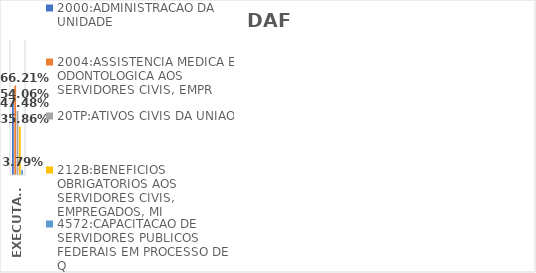
| Category | 2000:ADMINISTRACAO DA UNIDADE | 2004:ASSISTENCIA MEDICA E ODONTOLOGICA AOS SERVIDORES CIVIS, EMPR | 20TP:ATIVOS CIVIS DA UNIAO | 212B:BENEFICIOS OBRIGATORIOS AOS SERVIDORES CIVIS, EMPREGADOS, MI | 4572:CAPACITACAO DE SERVIDORES PUBLICOS FEDERAIS EM PROCESSO DE Q |
|---|---|---|---|---|---|
| EXECUTADO | 0.541 | 0.662 | 0.475 | 0.359 | 0.038 |